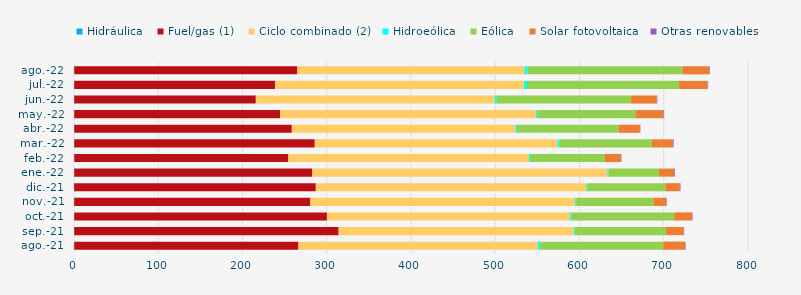
| Category | Hidráulica | Fuel/gas (1) | Ciclo combinado (2) | Hidroeólica | Eólica | Solar fotovoltaica | Otras renovables |
|---|---|---|---|---|---|---|---|
| ago.-21 | 0.281 | 266.149 | 284.301 | 2.663 | 145.95 | 26.121 | 0.57 |
| sep.-21 | 0.278 | 313.815 | 278.888 | 1.42 | 107.853 | 21.565 | 0.4 |
| oct.-21 | 0.282 | 299.917 | 288.429 | 1.853 | 121.987 | 20.979 | 0.756 |
| nov.-21 | 0.231 | 280.341 | 314.273 | 1.14 | 91.77 | 14.946 | 0.753 |
| dic.-21 | 0.155 | 286.856 | 321.013 | 1.228 | 92.868 | 16.937 | 0.822 |
| ene.-22 | 0.294 | 282.523 | 350.314 | 1.111 | 60.137 | 18.039 | 0.861 |
| feb.-22 | 0.251 | 254.215 | 285.333 | 1.482 | 88.982 | 18.799 | 0.721 |
| mar.-22 | 0.296 | 285.489 | 288.518 | 2.126 | 109.436 | 24.968 | 0.91 |
| abr.-22 | 0.274 | 258.292 | 265.373 | 1.753 | 120.763 | 25.165 | 0.614 |
| may.-22 | 0.299 | 244.426 | 303.457 | 1.917 | 116.774 | 32.867 | 0.721 |
| jun.-22 | 0.281 | 215.547 | 283.584 | 2.45 | 159.317 | 30.519 | 0.696 |
| jul.-22 | 0.294 | 238.325 | 295.517 | 3.563 | 180.243 | 34.108 | 0.688 |
| ago.-22 | 0.293 | 264.815 | 269.791 | 3.518 | 183.676 | 31.953 | 0.715 |